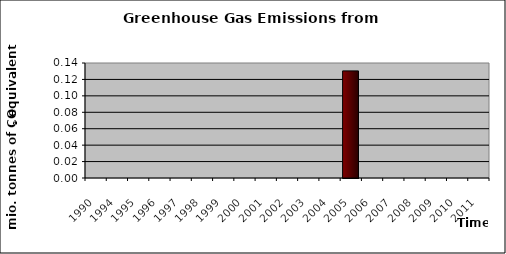
| Category | Series 0 |
|---|---|
| 1990.0 | 0 |
| 1994.0 | 0 |
| 1995.0 | 0 |
| 1996.0 | 0 |
| 1997.0 | 0 |
| 1998.0 | 0 |
| 1999.0 | 0 |
| 2000.0 | 0 |
| 2001.0 | 0 |
| 2002.0 | 0 |
| 2003.0 | 0 |
| 2004.0 | 0 |
| 2005.0 | 0.13 |
| 2006.0 | 0 |
| 2007.0 | 0 |
| 2008.0 | 0 |
| 2009.0 | 0 |
| 2010.0 | 0 |
| 2011.0 | 0 |